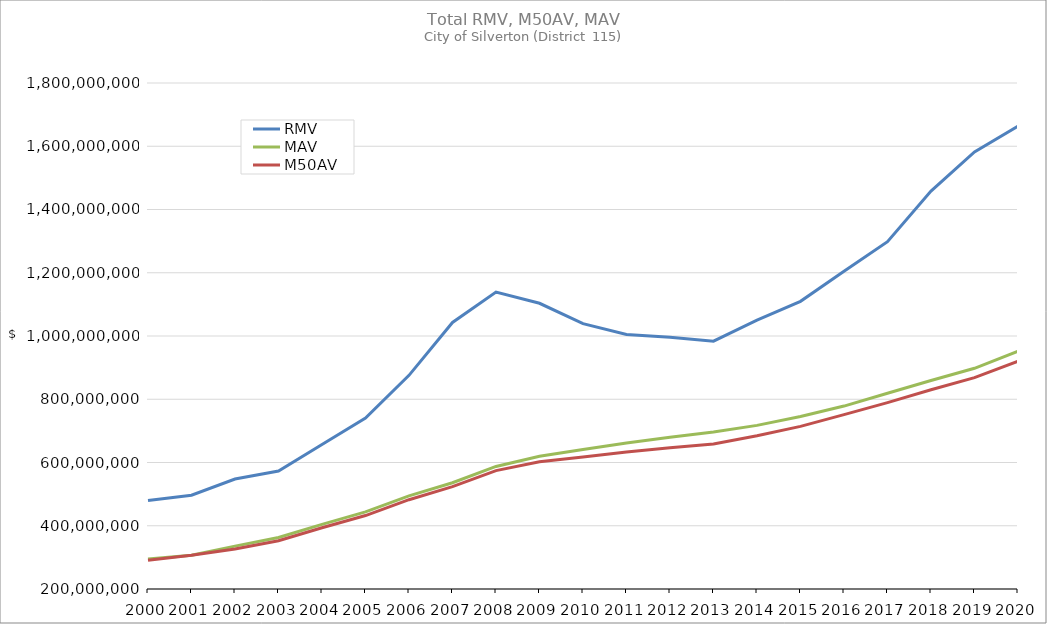
| Category | RMV | MAV | M50AV |
|---|---|---|---|
| 2000.0 | 479945597 | 295023063 | 290794481 |
| 2001.0 | 496473272 | 306834251 | 306834251 |
| 2002.0 | 547631158 | 335529664 | 326709042 |
| 2003.0 | 573043134 | 363055146 | 352635782 |
| 2004.0 | 657008940 | 404387813 | 393705368 |
| 2005.0 | 740580195 | 443880045 | 432206756 |
| 2006.0 | 875549360 | 494302152 | 482368286 |
| 2007.0 | 1042769243 | 535914284 | 523744339 |
| 2008.0 | 1138857784 | 587576631 | 574360307 |
| 2009.0 | 1103432206 | 620029087 | 602443715 |
| 2010.0 | 1038903969 | 640791493 | 617286594 |
| 2011.0 | 1005085006 | 661910702 | 633498406 |
| 2012.0 | 996006665 | 679839804 | 646741944 |
| 2013.0 | 983553476 | 696445980 | 658656520 |
| 2014.0 | 1049975712 | 717357282 | 684416134 |
| 2015.0 | 1109582375 | 745356989 | 714330070 |
| 2016.0 | 1205025725 | 778441747 | 751406807 |
| 2017.0 | 1298390184 | 818965140 | 789287179 |
| 2018.0 | 1458067201 | 859130051 | 829849240 |
| 2019.0 | 1582030970 | 897847095 | 868164674 |
| 2020.0 | 1663724887 | 951682311 | 920408618 |